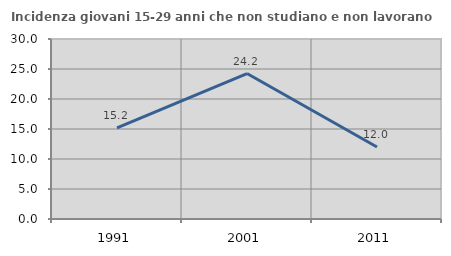
| Category | Incidenza giovani 15-29 anni che non studiano e non lavorano  |
|---|---|
| 1991.0 | 15.2 |
| 2001.0 | 24.242 |
| 2011.0 | 12 |